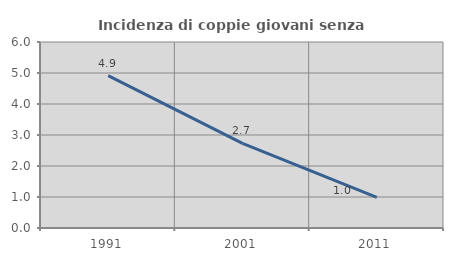
| Category | Incidenza di coppie giovani senza figli |
|---|---|
| 1991.0 | 4.918 |
| 2001.0 | 2.727 |
| 2011.0 | 0.99 |